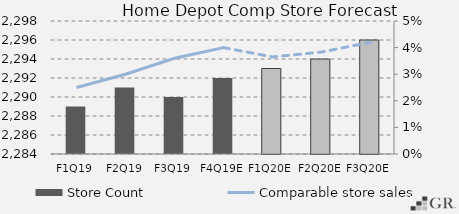
| Category | Store Count  |
|---|---|
|  F1Q19  | 2289 |
|  F2Q19  | 2291 |
|  F3Q19  | 2290 |
|  F4Q19E  | 2292 |
|  F1Q20E  | 2293 |
|  F2Q20E  | 2294 |
|  F3Q20E  | 2296 |